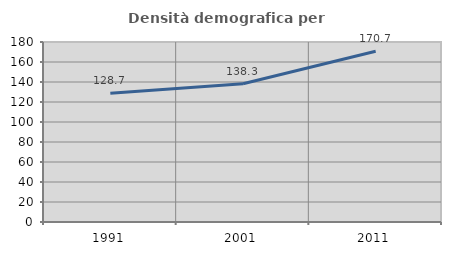
| Category | Densità demografica |
|---|---|
| 1991.0 | 128.651 |
| 2001.0 | 138.271 |
| 2011.0 | 170.68 |